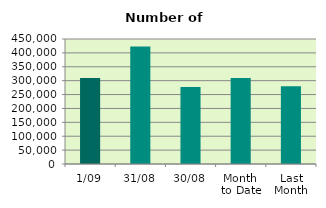
| Category | Series 0 |
|---|---|
| 1/09 | 310008 |
| 31/08 | 422714 |
| 30/08 | 277544 |
| Month 
to Date | 310008 |
| Last
Month | 279794.182 |